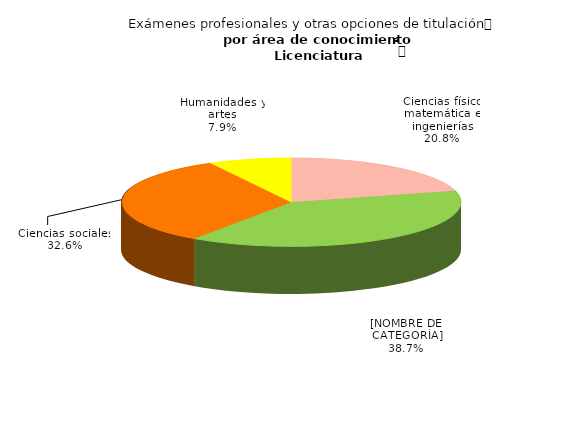
| Category | Series 0 |
|---|---|
| Ciencias físico matemática e ingenierías | 4731 |
| Ciencias biológicas, químicas y de la salud | 8798 |
| Ciencias sociales | 7391 |
| Humanidades y artes | 1783 |